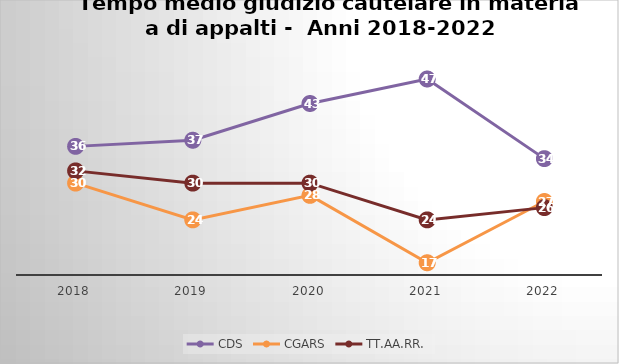
| Category | CDS | CGARS | TT.AA.RR. |
|---|---|---|---|
| 2018.0 | 36 | 30 | 32 |
| 2019.0 | 37 | 24 | 30 |
| 2020.0 | 43 | 28 | 30 |
| 2021.0 | 47 | 17 | 24 |
| 2022.0 | 34 | 27 | 26 |